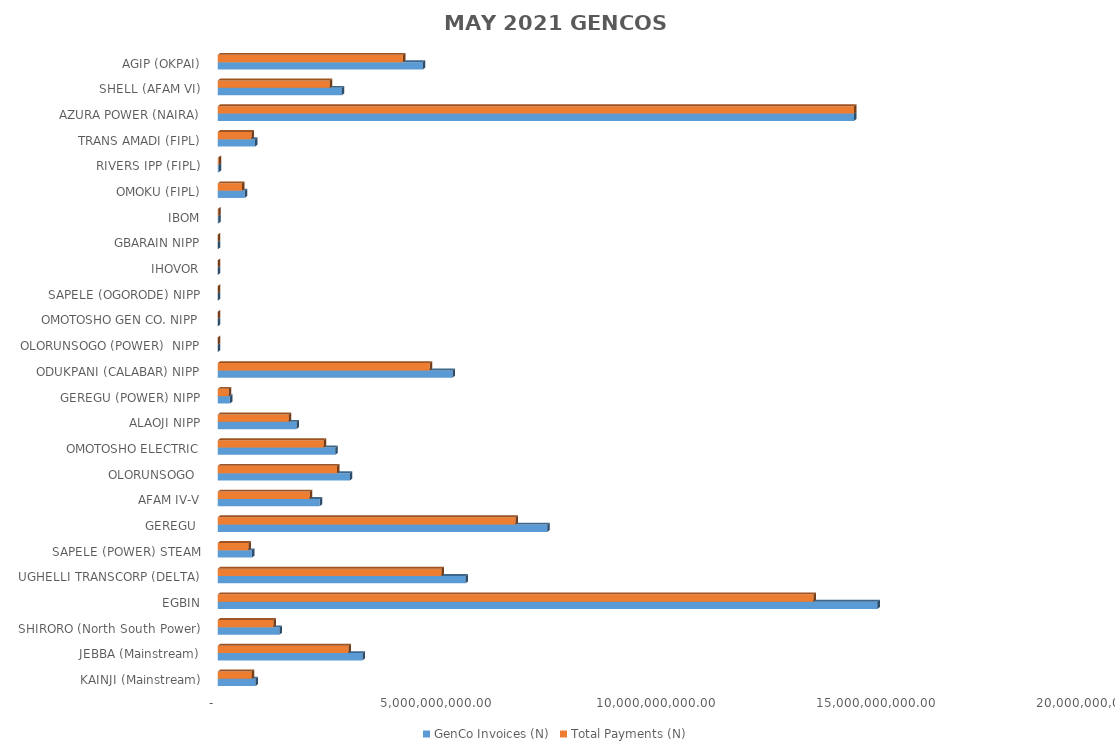
| Category | GenCo Invoices (N) | Total Payments (N) |
|---|---|---|
| KAINJI (Mainstream) | 858968738.81 | 775885114.547 |
| JEBBA (Mainstream) | 3290583974.66 | 2972302726.222 |
| SHIRORO (North South Power) | 1404958602.55 | 1269064189.441 |
| EGBIN | 15000141962.24 | 13549255448.703 |
| UGHELLI TRANSCORP (DELTA) | 5634655727.02 | 5089644484.904 |
| SAPELE (POWER) STEAM | 776611599.54 | 701493957.396 |
| GEREGU  | 7494094382.03 | 6769229210.925 |
| AFAM IV-V | 2316997262.75 | 2092886045.077 |
| OLORUNSOGO  | 3003189758.79 | 2712706673.391 |
| OMOTOSHO ELECTRIC | 2670821110.49 | 2412486333.457 |
| ALAOJI NIPP | 1789001178.31 | 1615960303.841 |
| GEREGU (POWER) NIPP | 276192217.16 | 249477565.79 |
| ODUKPANI (CALABAR) NIPP | 5335750991.05 | 4819651265.328 |
| OLORUNSOGO (POWER)  NIPP | 0 | 0 |
| OMOTOSHO GEN CO. NIPP | 0 | 0 |
| SAPELE (OGORODE) NIPP | 0 | 0 |
| IHOVOR | 0 | 0 |
| GBARAIN NIPP | 0 | 0 |
| IBOM | 9961309.63 | 8997803.429 |
| OMOKU (FIPL) | 612410429.06 | 553175120.854 |
| RIVERS IPP (FIPL) | 22534028.16 | 20354427.618 |
| TRANS AMADI (FIPL) | 848219971 | 766176019.714 |
| AZURA POWER (NAIRA) | 14469041866.995 | 14469041866.991 |
| SHELL (AFAM VI) | 2822034298.718 | 2549073448.411 |
| AGIP (OKPAI) | 4661844683.375 | 4210928445.626 |